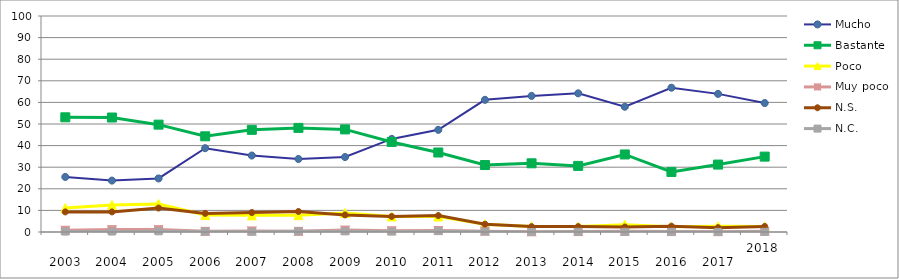
| Category | Mucho | Bastante | Poco | Muy poco | N.S. | N.C. |
|---|---|---|---|---|---|---|
| 
2003 | 25.5 | 53.1 | 11.1 | 0.8 | 9.3 | 0.2 |
| 
2004 | 23.8 | 53 | 12.5 | 1.1 | 9.3 | 0.2 |
| 
2005 | 24.8 | 49.7 | 13 | 1.1 | 11.1 | 0.3 |
| 
2006 | 38.8 | 44.3 | 7.9 | 0.3 | 8.6 | 0.2 |
| 
2007 | 35.4 | 47.3 | 7.7 | 0.5 | 9 | 0.1 |
| 
2008 | 33.8 | 48.2 | 7.8 | 0.3 | 9.5 | 0.3 |
| 
2009 | 34.7 | 47.5 | 8.8 | 0.9 | 7.9 | 0.3 |
| 
2010 | 43.1 | 41.7 | 7.2 | 0.6 | 7.2 | 0.2 |
| 
2011 | 47.3 | 36.8 | 7.2 | 0.7 | 7.6 | 0.4 |
| 
2012 | 61.2 | 31 | 3.6 | 0.4 | 3.6 | 0.2 |
| 
2013 | 63 | 31.8 | 2.6 | 0.1 | 2.5 | 0 |
| 
2014 | 64.2 | 30.6 | 2.5 | 0.2 | 2.5 | 0.1 |
| 
2015 | 58 | 35.9 | 3.4 | 0.3 | 2.3 | 0.1 |
| 
2016 | 66.8 | 27.8 | 2.4 | 0.2 | 2.7 | 0.1 |
| 
2017 | 63.943 | 31.22 | 2.642 | 0.163 | 1.992 | 0.041 |
| 2018 | 59.7 | 34.9 | 2.5 | 0.3 | 2.6 | 0.1 |